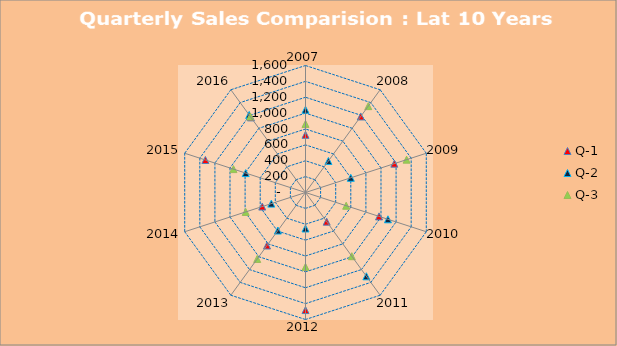
| Category | Q-1 | Q-2 | Q-3 |
|---|---|---|---|
| 2007.0 | 727 | 1043 | 864 |
| 2008.0 | 1184 | 491 | 1345 |
| 2009.0 | 1177 | 600 | 1339 |
| 2010.0 | 974 | 1092 | 539 |
| 2011.0 | 454 | 1305 | 992 |
| 2012.0 | 1481 | 453 | 937 |
| 2013.0 | 825 | 592 | 1035 |
| 2014.0 | 573 | 453 | 792 |
| 2015.0 | 1326 | 792 | 954 |
| 2016.0 | 1170 | 1207 | 1184 |